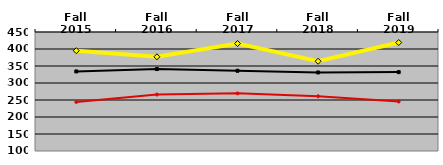
| Category | NATIONAL MEDIAN | WEST MEDIAN | TEXAS LUTHERAN |
|---|---|---|---|
| Fall 2015 | 334 | 244 | 395 |
| Fall 2016 | 341 | 266 | 377 |
| Fall 2017 | 336 | 269.5 | 416 |
| Fall 2018 | 331 | 261 | 364 |
| Fall 2019 | 332 | 245.5 | 419 |